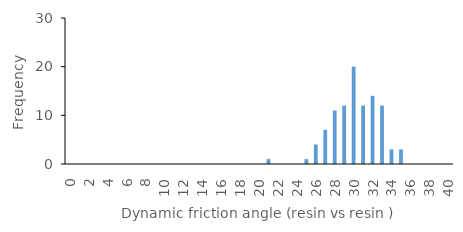
| Category | Series 0 |
|---|---|
| 0.0 | 0 |
| 1.0 | 0 |
| 2.0 | 0 |
| 3.0 | 0 |
| 4.0 | 0 |
| 5.0 | 0 |
| 6.0 | 0 |
| 7.0 | 0 |
| 8.0 | 0 |
| 9.0 | 0 |
| 10.0 | 0 |
| 11.0 | 0 |
| 12.0 | 0 |
| 13.0 | 0 |
| 14.0 | 0 |
| 15.0 | 0 |
| 16.0 | 0 |
| 17.0 | 0 |
| 18.0 | 0 |
| 19.0 | 0 |
| 20.0 | 0 |
| 21.0 | 1 |
| 22.0 | 0 |
| 23.0 | 0 |
| 24.0 | 0 |
| 25.0 | 1 |
| 26.0 | 4 |
| 27.0 | 7 |
| 28.0 | 11 |
| 29.0 | 12 |
| 30.0 | 20 |
| 31.0 | 12 |
| 32.0 | 14 |
| 33.0 | 12 |
| 34.0 | 3 |
| 35.0 | 3 |
| 36.0 | 0 |
| 37.0 | 0 |
| 38.0 | 0 |
| 39.0 | 0 |
| 40.0 | 0 |